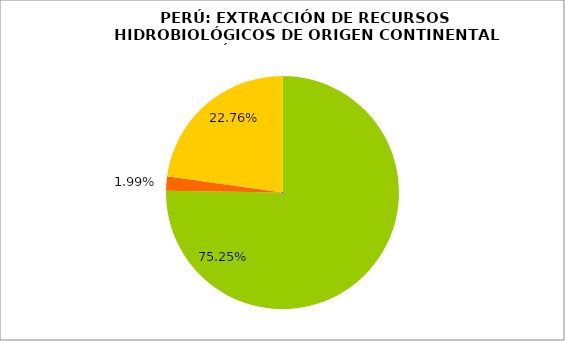
| Category | Series 0 |
|---|---|
| Acuicultura | 0.753 |
| Sierra | 0.02 |
| Amazonía | 0.228 |